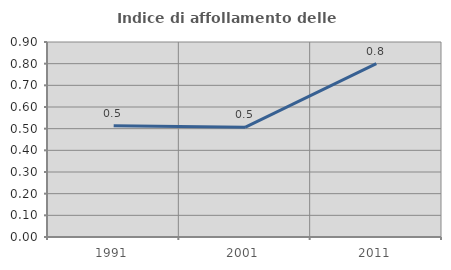
| Category | Indice di affollamento delle abitazioni  |
|---|---|
| 1991.0 | 0.513 |
| 2001.0 | 0.506 |
| 2011.0 | 0.8 |